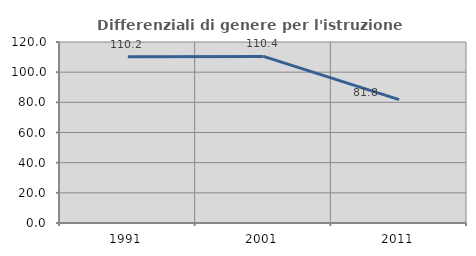
| Category | Differenziali di genere per l'istruzione superiore |
|---|---|
| 1991.0 | 110.185 |
| 2001.0 | 110.429 |
| 2011.0 | 81.818 |